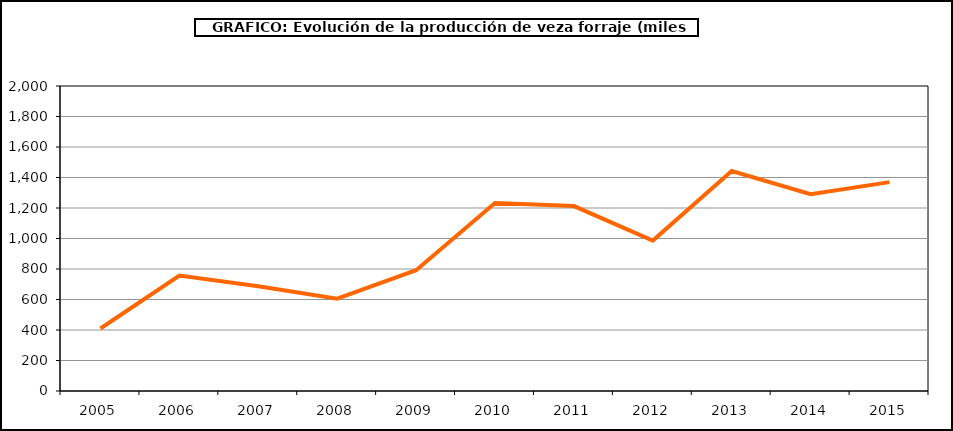
| Category | Producción |
|---|---|
| 2005.0 | 410.073 |
| 2006.0 | 756.947 |
| 2007.0 | 686.571 |
| 2008.0 | 605.65 |
| 2009.0 | 791.875 |
| 2010.0 | 1232.646 |
| 2011.0 | 1212.426 |
| 2012.0 | 986.263 |
| 2013.0 | 1442.069 |
| 2014.0 | 1290.565 |
| 2015.0 | 1369.532 |